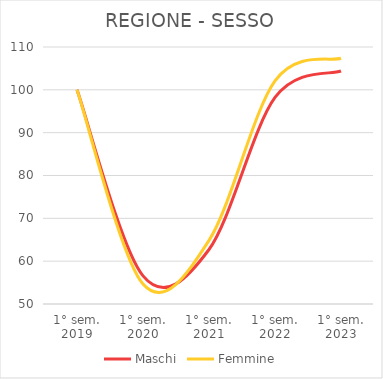
| Category | Maschi | Femmine |
|---|---|---|
| 1° sem.
2019 | 100 | 100 |
| 1° sem.
2020 | 56.558 | 54.653 |
| 1° sem.
2021 | 62.725 | 64.845 |
| 1° sem.
2022 | 98.218 | 102.082 |
| 1° sem.
2023 | 104.397 | 107.366 |